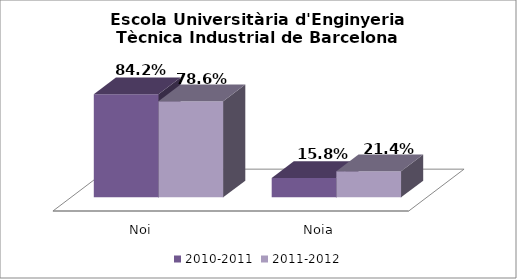
| Category | 2010-2011 | 2011-2012 |
|---|---|---|
| Noi | 0.842 | 0.786 |
| Noia | 0.158 | 0.214 |